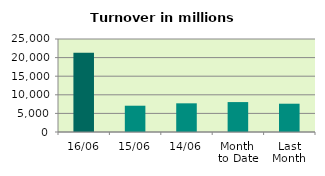
| Category | Series 0 |
|---|---|
| 16/06 | 21335.774 |
| 15/06 | 7064.879 |
| 14/06 | 7709.594 |
| Month 
to Date | 8043.683 |
| Last
Month | 7604.877 |